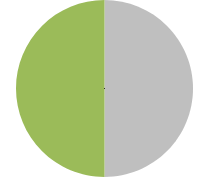
| Category | Kör |
|---|---|
| 0 | 50 |
| 1 | 50 |